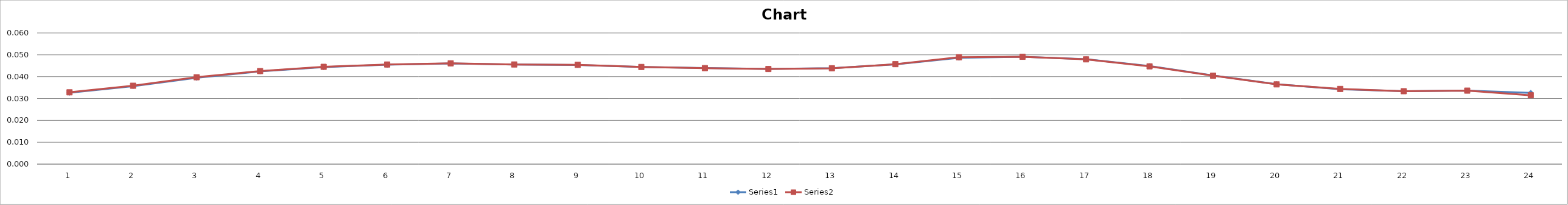
| Category | Series 0 | Series 1 |
|---|---|---|
| 0 | 0.033 | 0.033 |
| 1 | 0.036 | 0.036 |
| 2 | 0.039 | 0.04 |
| 3 | 0.042 | 0.043 |
| 4 | 0.044 | 0.045 |
| 5 | 0.045 | 0.046 |
| 6 | 0.046 | 0.046 |
| 7 | 0.046 | 0.046 |
| 8 | 0.045 | 0.045 |
| 9 | 0.044 | 0.044 |
| 10 | 0.044 | 0.044 |
| 11 | 0.044 | 0.044 |
| 12 | 0.044 | 0.044 |
| 13 | 0.046 | 0.046 |
| 14 | 0.049 | 0.049 |
| 15 | 0.049 | 0.049 |
| 16 | 0.048 | 0.048 |
| 17 | 0.045 | 0.045 |
| 18 | 0.041 | 0.04 |
| 19 | 0.037 | 0.036 |
| 20 | 0.034 | 0.034 |
| 21 | 0.033 | 0.033 |
| 22 | 0.034 | 0.034 |
| 23 | 0.033 | 0.031 |